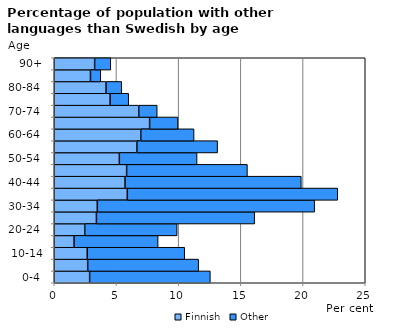
| Category | Finnish | Other |
|---|---|---|
|   0-4  | 2.846 | 9.702 |
|   5-9  | 2.688 | 8.919 |
| 10-14 | 2.652 | 7.836 |
| 15-19  | 1.593 | 6.756 |
| 20-24  | 2.452 | 7.429 |
| 25-29  | 3.389 | 12.722 |
| 30-34  | 3.46 | 17.474 |
| 35-39  | 5.873 | 16.918 |
| 40-44  | 5.69 | 14.171 |
| 45-49  | 5.817 | 9.712 |
| 50-54  | 5.231 | 6.25 |
| 55-59  | 6.643 | 6.49 |
| 60-64  | 6.956 | 4.284 |
| 65-69  | 7.664 | 2.279 |
| 70-74  | 6.792 | 1.484 |
| 75-79  | 4.489 | 1.496 |
| 80-84  | 4.161 | 1.261 |
| 85-89  | 2.911 | 0.832 |
| 90+ | 3.247 | 1.299 |